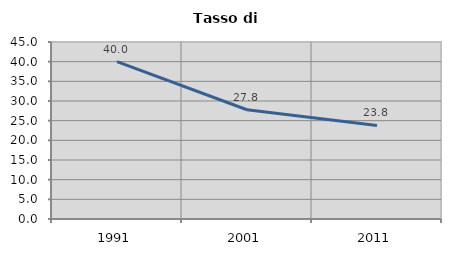
| Category | Tasso di disoccupazione   |
|---|---|
| 1991.0 | 40 |
| 2001.0 | 27.768 |
| 2011.0 | 23.799 |